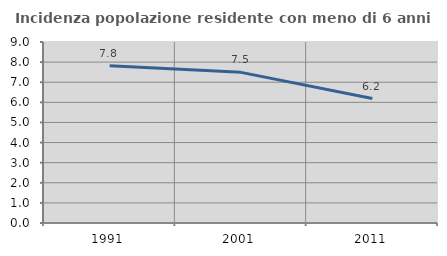
| Category | Incidenza popolazione residente con meno di 6 anni |
|---|---|
| 1991.0 | 7.814 |
| 2001.0 | 7.49 |
| 2011.0 | 6.187 |